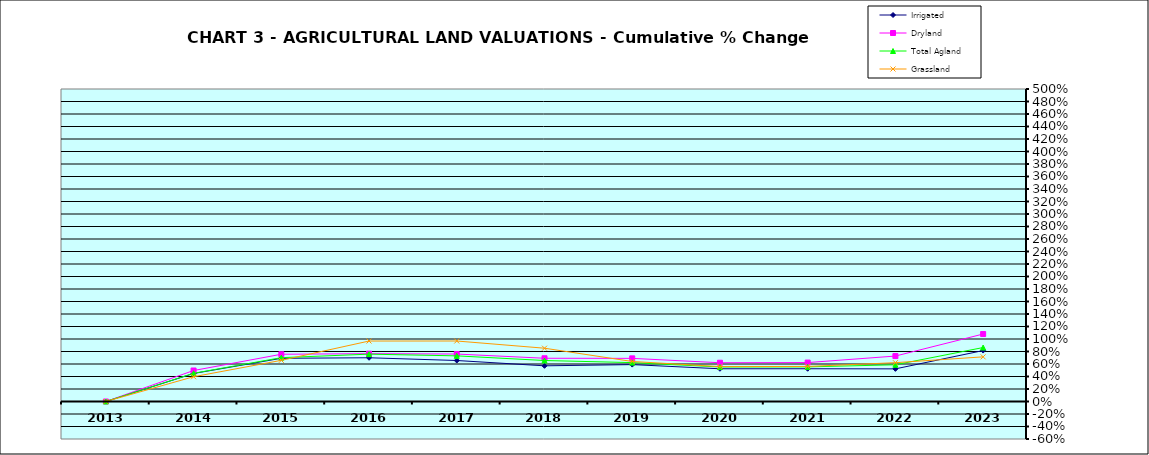
| Category | Irrigated | Dryland | Total Agland | Grassland |
|---|---|---|---|---|
| 2013.0 | 0 | 0 | 0 | 0 |
| 2014.0 | 0.448 | 0.496 | 0.451 | 0.396 |
| 2015.0 | 0.691 | 0.756 | 0.701 | 0.659 |
| 2016.0 | 0.7 | 0.765 | 0.758 | 0.967 |
| 2017.0 | 0.656 | 0.759 | 0.73 | 0.968 |
| 2018.0 | 0.571 | 0.692 | 0.656 | 0.853 |
| 2019.0 | 0.59 | 0.69 | 0.622 | 0.64 |
| 2020.0 | 0.524 | 0.62 | 0.552 | 0.558 |
| 2021.0 | 0.524 | 0.623 | 0.554 | 0.561 |
| 2022.0 | 0.522 | 0.727 | 0.588 | 0.621 |
| 2023.0 | 0.815 | 1.079 | 0.863 | 0.714 |